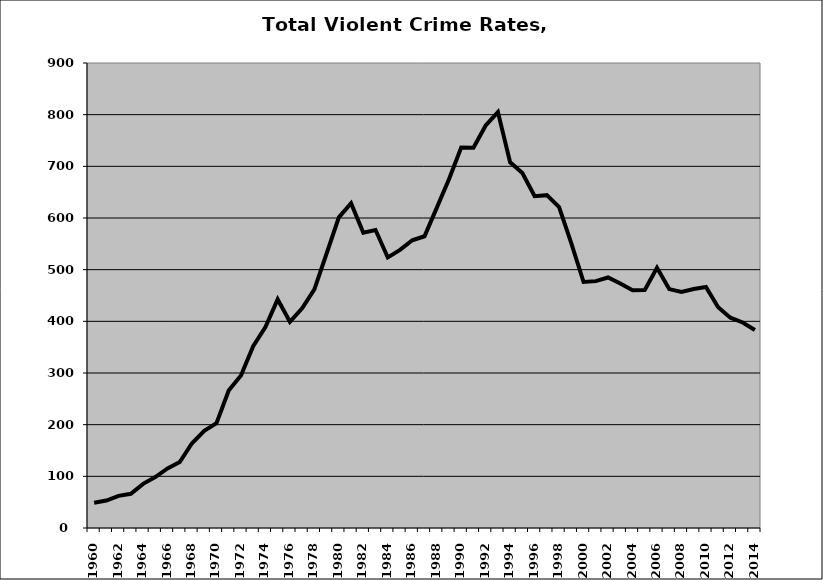
| Category | VCR |
|---|---|
| 1960.0 | 48.79 |
| 1961.0 | 53.057 |
| 1962.0 | 62.139 |
| 1963.0 | 66.194 |
| 1964.0 | 85.407 |
| 1965.0 | 98.542 |
| 1966.0 | 115.196 |
| 1967.0 | 127.633 |
| 1968.0 | 163.987 |
| 1969.0 | 187.891 |
| 1970.0 | 202.877 |
| 1971.0 | 266.013 |
| 1972.0 | 295.248 |
| 1973.0 | 351.925 |
| 1974.0 | 388.707 |
| 1975.0 | 442.57 |
| 1976.0 | 399.208 |
| 1977.0 | 425.337 |
| 1978.0 | 461.95 |
| 1979.0 | 531.288 |
| 1980.0 | 601.297 |
| 1981.0 | 628.648 |
| 1982.0 | 571.372 |
| 1983.0 | 576.799 |
| 1984.0 | 523.663 |
| 1985.0 | 538.2 |
| 1986.0 | 556.859 |
| 1987.0 | 564.646 |
| 1988.0 | 619.588 |
| 1989.0 | 674.987 |
| 1990.0 | 736.318 |
| 1991.0 | 736.124 |
| 1992.0 | 779.043 |
| 1993.0 | 804.94 |
| 1994.0 | 707.648 |
| 1995.0 | 687.175 |
| 1996.0 | 642.186 |
| 1997.0 | 644.181 |
| 1998.0 | 621.311 |
| 1999.0 | 550.965 |
| 2000.0 | 476.131 |
| 2001.0 | 477.804 |
| 2002.0 | 484.864 |
| 2003.0 | 473.136 |
| 2004.0 | 460.235 |
| 2005.0 | 460.785 |
| 2006.0 | 503.496 |
| 2007.0 | 462.374 |
| 2008.0 | 456.752 |
| 2009.0 | 462.616 |
| 2010.0 | 466.627 |
| 2011.0 | 427.304 |
| 2012.0 | 407.009 |
| 2013.0 | 397.727 |
| 2014.0 | 383.194 |